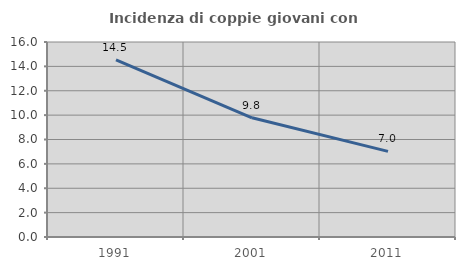
| Category | Incidenza di coppie giovani con figli |
|---|---|
| 1991.0 | 14.528 |
| 2001.0 | 9.783 |
| 2011.0 | 7.023 |